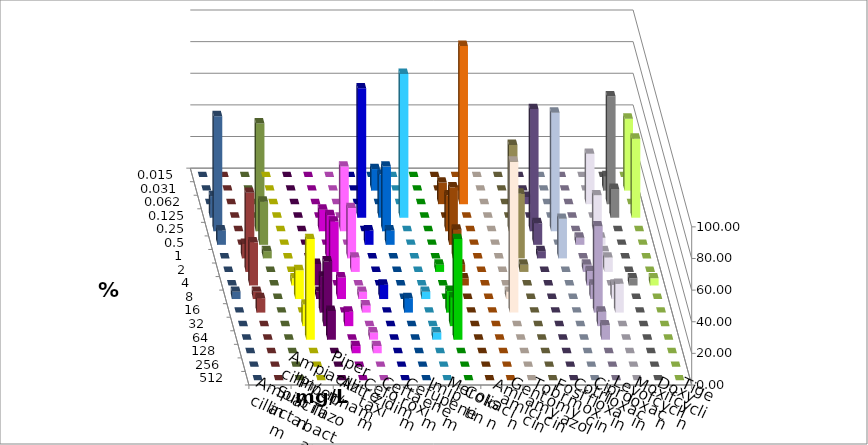
| Category | Ampicillin | Ampicillin/ Sulbactam | Piperacillin | Piperacillin/ Tazobactam | Aztreonam | Cefotaxim | Ceftazidim | Cefuroxim | Imipenem | Meropenem | Colistin | Amikacin | Gentamicin | Tobramycin | Fosfomycin | Cotrimoxazol | Ciprofloxacin | Levofloxacin | Moxifloxacin | Doxycyclin | Tigecyclin |
|---|---|---|---|---|---|---|---|---|---|---|---|---|---|---|---|---|---|---|---|---|---|
| 0.015 | 0 | 0 | 0 | 0 | 0 | 0 | 0 | 0 | 0 | 0 | 0 | 0 | 0 | 0 | 0 | 0 | 0 | 0 | 0 | 0 | 0 |
| 0.031 | 0 | 0 | 0 | 0 | 0 | 13.636 | 0 | 0 | 0 | 0 | 0 | 0 | 0 | 0 | 0 | 0 | 9.091 | 45.455 | 0 | 0 | 0 |
| 0.062 | 0 | 0 | 0 | 0 | 0 | 0 | 0 | 0 | 13.636 | 100 | 0 | 0 | 4.545 | 0 | 0 | 31.818 | 68.182 | 0 | 0 | 0 | 0 |
| 0.125 | 0 | 0 | 0 | 0 | 81.818 | 27.273 | 90.909 | 0 | 0 | 0 | 0 | 0 | 0 | 0 | 0 | 0 | 18.182 | 50 | 13.636 | 0 | 0 |
| 0.25 | 0 | 0 | 13.636 | 40.909 | 0 | 40.909 | 0 | 0 | 22.727 | 0 | 0 | 54.545 | 77.273 | 75 | 0 | 22.727 | 0 | 0 | 72.727 | 0 | 68.182 |
| 0.5 | 0 | 0 | 0 | 0 | 9.091 | 9.091 | 0 | 0 | 36.364 | 0 | 0 | 0 | 13.636 | 0 | 4.545 | 4.545 | 0 | 0 | 9.091 | 0 | 27.273 |
| 1.0 | 0 | 0 | 27.273 | 31.818 | 0 | 0 | 0 | 0 | 18.182 | 0 | 0 | 40.909 | 4.545 | 25 | 0 | 4.545 | 0 | 0 | 0 | 9.091 | 4.545 |
| 2.0 | 0 | 0 | 31.818 | 9.091 | 0 | 0 | 0 | 4.545 | 4.545 | 0 | 0 | 4.545 | 0 | 0 | 4.545 | 9.091 | 0 | 0 | 0 | 50 | 0 |
| 4.0 | 4.545 | 13.636 | 0 | 0 | 0 | 0 | 0 | 0 | 4.545 | 0 | 0 | 0 | 0 | 0 | 9.091 | 0 | 4.545 | 4.545 | 0 | 27.273 | 0 |
| 8.0 | 18.182 | 4.545 | 13.636 | 4.545 | 9.091 | 0 | 4.545 | 0 | 0 | 0 | 4.545 | 0 | 0 | 0 | 9.091 | 9.091 | 0 | 0 | 4.545 | 4.545 | 0 |
| 16.0 | 0 | 22.727 | 0 | 4.545 | 0 | 9.091 | 0 | 13.636 | 0 | 0 | 95.455 | 0 | 0 | 0 | 54.545 | 18.182 | 0 | 0 | 0 | 9.091 | 0 |
| 32.0 | 13.636 | 40.909 | 9.091 | 0 | 0 | 0 | 0 | 18.182 | 0 | 0 | 0 | 0 | 0 | 0 | 9.091 | 0 | 0 | 0 | 0 | 0 | 0 |
| 64.0 | 63.636 | 18.182 | 0 | 4.545 | 0 | 0 | 4.545 | 63.636 | 0 | 0 | 0 | 0 | 0 | 0 | 9.091 | 0 | 0 | 0 | 0 | 0 | 0 |
| 128.0 | 0 | 0 | 4.545 | 4.545 | 0 | 0 | 0 | 0 | 0 | 0 | 0 | 0 | 0 | 0 | 0 | 0 | 0 | 0 | 0 | 0 | 0 |
| 256.0 | 0 | 0 | 0 | 0 | 0 | 0 | 0 | 0 | 0 | 0 | 0 | 0 | 0 | 0 | 0 | 0 | 0 | 0 | 0 | 0 | 0 |
| 512.0 | 0 | 0 | 0 | 0 | 0 | 0 | 0 | 0 | 0 | 0 | 0 | 0 | 0 | 0 | 0 | 0 | 0 | 0 | 0 | 0 | 0 |